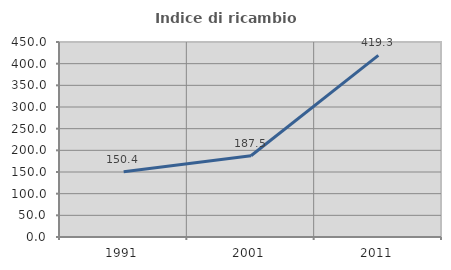
| Category | Indice di ricambio occupazionale  |
|---|---|
| 1991.0 | 150.427 |
| 2001.0 | 187.5 |
| 2011.0 | 419.298 |